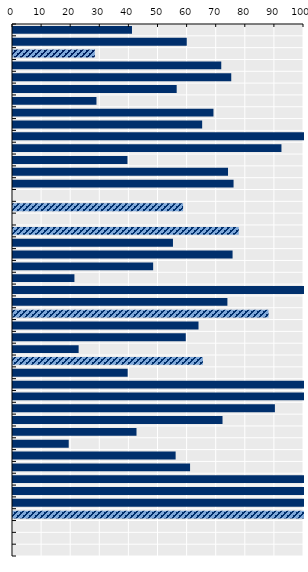
| Category | Average payment rate (%) across father-specific leave |
|---|---|
| Korea | 40.888 |
| Japan | 59.714 |
| France | 28.115 |
| Luxembourg | 71.566 |
| Slovak Republic | 75 |
| Portugal | 56.25 |
| Belgium | 28.681 |
| Iceland | 68.886 |
| Finland | 65.004 |
| Spain | 100 |
| Norway | 92.252 |
| Italy | 39.333 |
| Netherlands | 73.888 |
| Sweden | 75.794 |
| EU average | 0 |
| Austria | 58.453 |
| OECD average | 0 |
| Lithuania | 77.58 |
| Greece | 54.97 |
| Poland | 75.455 |
| Denmark | 48.162 |
| Hungary | 21.111 |
| Slovenia | 100 |
| Croatia | 73.678 |
| Romania | 87.813 |
| Latvia | 63.75 |
| Malta | 59.376 |
| Ireland | 22.556 |
| Germany | 65.251 |
| Canada | 39.408 |
| Estonia | 100 |
| Colombia | 100 |
| Bulgaria | 90 |
| Cyprus | 72 |
| Australia | 42.439 |
| United Kingdom | 19.148 |
| Switzerland | 55.887 |
| Czechia | 60.85 |
| Costa Rica | 100 |
| Türkiye | 100 |
| Mexico | 100 |
| Chile | 100 |
| New Zealand | 0 |
| Israel | 0 |
| United States | 0 |